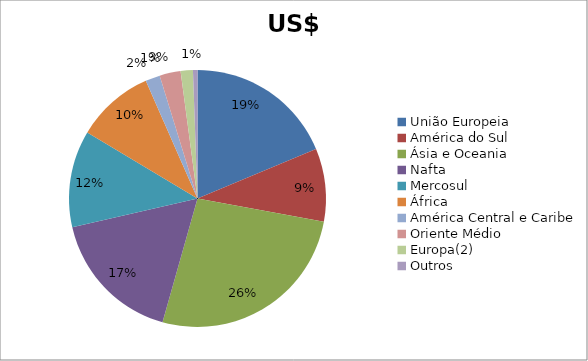
| Category | Series 0 |
|---|---|
| União Europeia | 2383987845 |
| América do Sul | 1175317563 |
| Ásia e Oceania | 3377459275 |
| Nafta | 2169516763 |
| Mercosul | 1554751211 |
| África | 1251774011 |
| América Central e Caribe | 234397625 |
| Oriente Médio | 337811724 |
| Europa(2) | 195893201 |
| Outros | 72299382 |